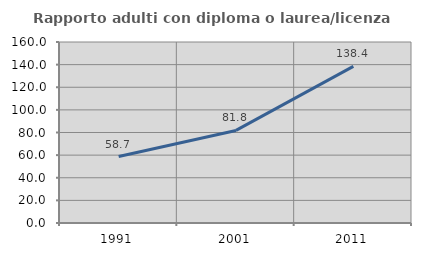
| Category | Rapporto adulti con diploma o laurea/licenza media  |
|---|---|
| 1991.0 | 58.748 |
| 2001.0 | 81.824 |
| 2011.0 | 138.436 |